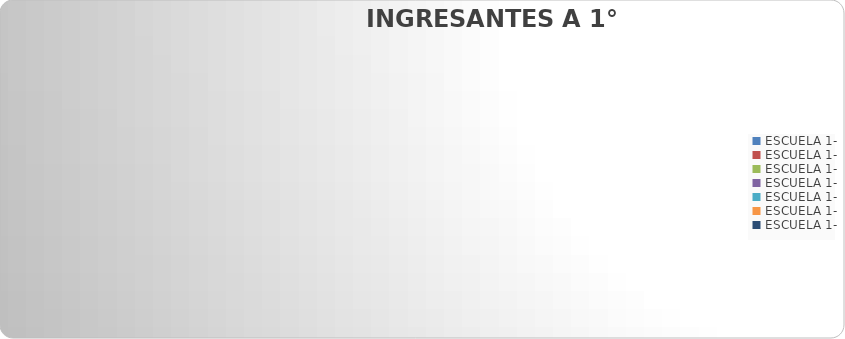
| Category | ESCUELA 1- |
|---|---|
| ESCUELA 1- | 0 |
| ESCUELA 1- | 0 |
| ESCUELA 1- | 0 |
| ESCUELA 1- | 0 |
| ESCUELA 1- | 0 |
| ESCUELA 1- | 0 |
| ESCUELA 1- | 0 |